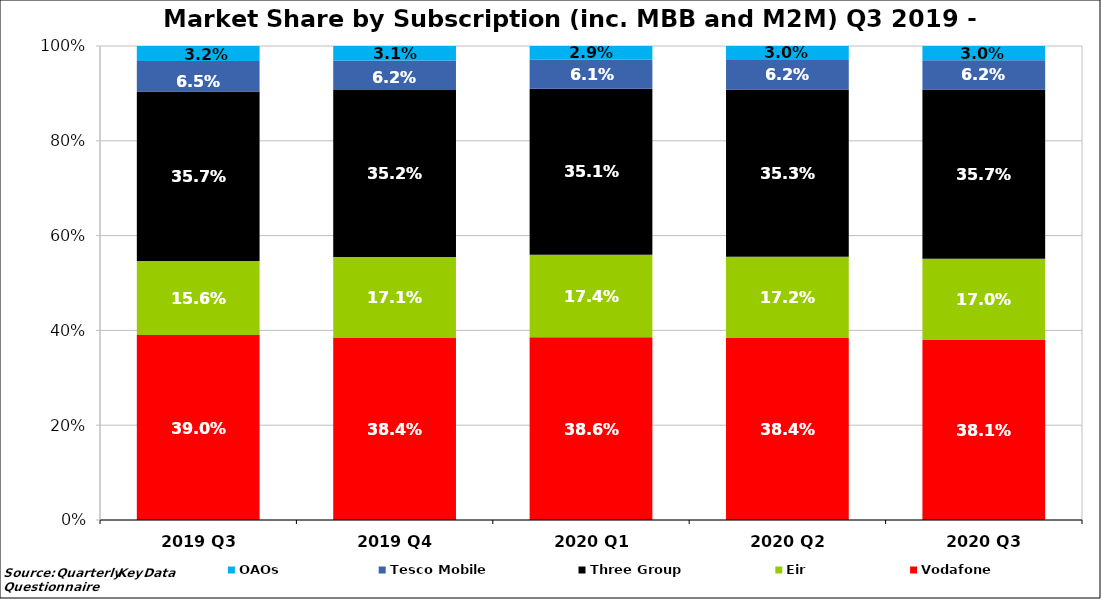
| Category | Vodafone | Eir  | Three Group | Tesco Mobile | OAOs |
|---|---|---|---|---|---|
| 2019 Q3 | 0.39 | 0.156 | 0.357 | 0.065 | 0.032 |
| 2019 Q4 | 0.384 | 0.171 | 0.352 | 0.062 | 0.031 |
| 2020 Q1 | 0.386 | 0.174 | 0.351 | 0.061 | 0.029 |
| 2020 Q2 | 0.384 | 0.172 | 0.353 | 0.062 | 0.03 |
| 2020 Q3 | 0.381 | 0.17 | 0.357 | 0.062 | 0.03 |